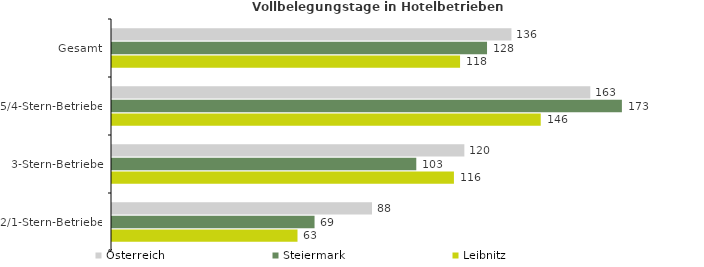
| Category | Österreich | Steiermark | Leibnitz |
|---|---|---|---|
| Gesamt | 135.866 | 127.561 | 118.389 |
| 5/4-Stern-Betriebe | 162.683 | 173.435 | 145.826 |
| 3-Stern-Betriebe | 119.851 | 103.499 | 116.302 |
| 2/1-Stern-Betriebe | 88.435 | 68.894 | 63.096 |